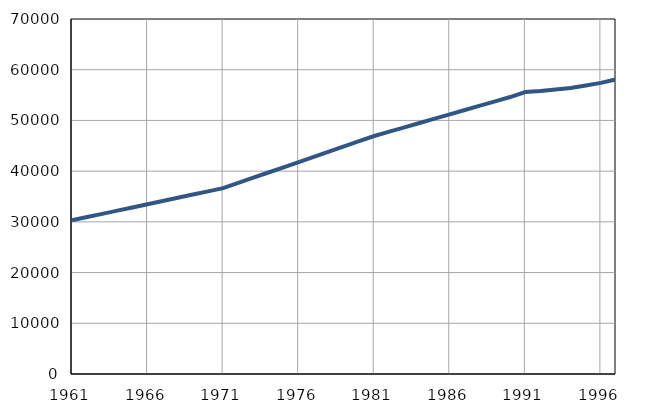
| Category | Број
становника |
|---|---|
| 1961.0 | 30308 |
| 1962.0 | 30942 |
| 1963.0 | 31576 |
| 1964.0 | 32210 |
| 1965.0 | 32844 |
| 1966.0 | 33478 |
| 1967.0 | 34112 |
| 1968.0 | 34746 |
| 1969.0 | 35380 |
| 1970.0 | 36014 |
| 1971.0 | 36650 |
| 1972.0 | 37678 |
| 1973.0 | 38706 |
| 1974.0 | 39734 |
| 1975.0 | 40762 |
| 1976.0 | 41790 |
| 1977.0 | 42818 |
| 1978.0 | 43846 |
| 1979.0 | 44874 |
| 1980.0 | 45902 |
| 1981.0 | 46927 |
| 1982.0 | 47781 |
| 1983.0 | 48635 |
| 1984.0 | 49489 |
| 1985.0 | 50343 |
| 1986.0 | 51197 |
| 1987.0 | 52051 |
| 1988.0 | 52905 |
| 1989.0 | 53759 |
| 1990.0 | 54613 |
| 1991.0 | 55600 |
| 1992.0 | 55800 |
| 1993.0 | 56100 |
| 1994.0 | 56400 |
| 1995.0 | 56900 |
| 1996.0 | 57400 |
| 1997.0 | 58100 |